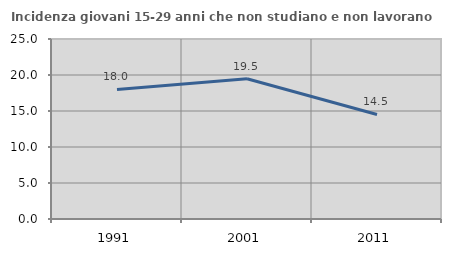
| Category | Incidenza giovani 15-29 anni che non studiano e non lavorano  |
|---|---|
| 1991.0 | 17.986 |
| 2001.0 | 19.472 |
| 2011.0 | 14.516 |